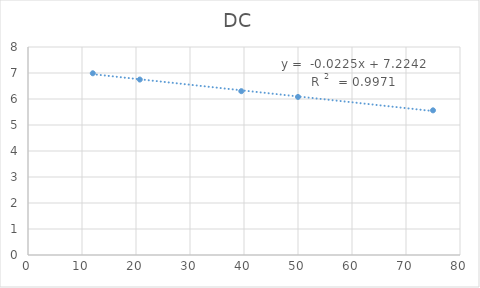
| Category | DC |
|---|---|
| 75.0 | 5.563 |
| 50.0 | 6.079 |
| 39.5 | 6.301 |
| 20.7 | 6.748 |
| 12.0 | 6.989 |